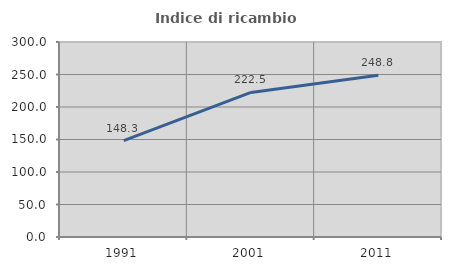
| Category | Indice di ricambio occupazionale  |
|---|---|
| 1991.0 | 148.333 |
| 2001.0 | 222.477 |
| 2011.0 | 248.828 |